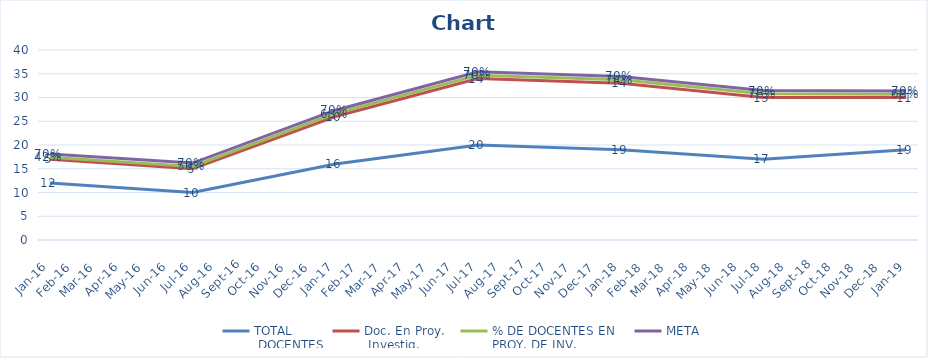
| Category | TOTAL
 DOCENTES | Doc. En Proy.
 Investig.  | % DE DOCENTES EN 
PROY. DE INV. | META |
|---|---|---|---|---|
| 2016-01-01 | 12 | 5 | 0.417 | 0.7 |
| 2016-07-01 | 10 | 5 | 0.5 | 0.7 |
| 2017-01-01 | 16 | 10 | 0.625 | 0.7 |
| 2017-07-01 | 20 | 14 | 0.7 | 0.7 |
| 2018-01-01 | 19 | 14 | 0.737 | 0.7 |
| 2018-07-01 | 17 | 13 | 0.765 | 0.7 |
| 2019-01-01 | 19 | 11 | 0.684 | 0.7 |